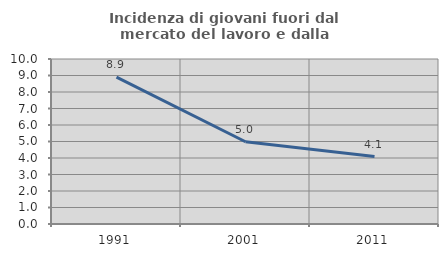
| Category | Incidenza di giovani fuori dal mercato del lavoro e dalla formazione  |
|---|---|
| 1991.0 | 8.906 |
| 2001.0 | 4.986 |
| 2011.0 | 4.088 |